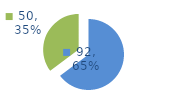
| Category | Series 0 |
|---|---|
| 0 | 92 |
| 1 | 50 |